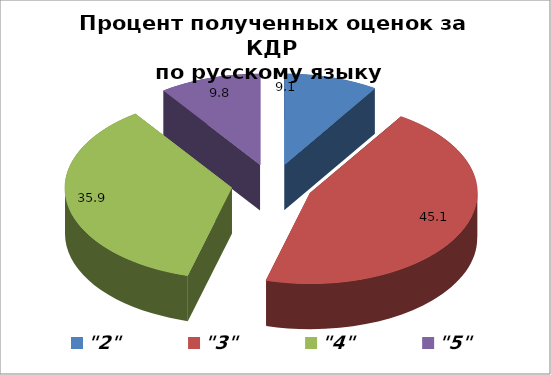
| Category | Series 0 |
|---|---|
| "2" | 9.1 |
| "3" | 45.1 |
| "4" | 35.9 |
| "5" | 9.8 |